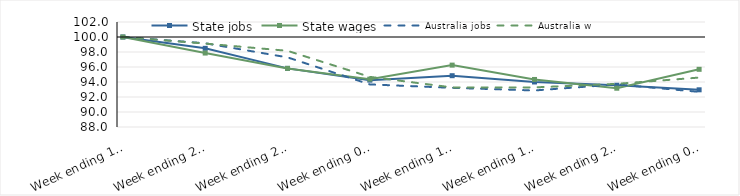
| Category | State jobs | State wages | Australia jobs | Australia wages |
|---|---|---|---|---|
| 2020-03-14 | 100 | 100 | 100 | 100 |
| 2020-03-21 | 98.488 | 97.86 | 99.165 | 99.123 |
| 2020-03-28 | 95.817 | 95.814 | 97.282 | 98.156 |
| 2020-04-04 | 94.248 | 94.384 | 93.679 | 94.686 |
| 2020-04-11 | 94.84 | 96.251 | 93.222 | 93.277 |
| 2020-04-18 | 94.003 | 94.338 | 92.871 | 93.281 |
| 2020-04-25 | 93.566 | 93.17 | 93.679 | 93.754 |
| 2020-05-02 | 92.959 | 95.691 | 92.686 | 94.591 |